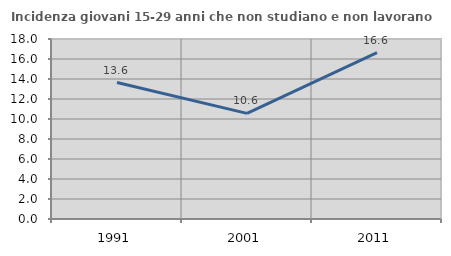
| Category | Incidenza giovani 15-29 anni che non studiano e non lavorano  |
|---|---|
| 1991.0 | 13.646 |
| 2001.0 | 10.566 |
| 2011.0 | 16.647 |